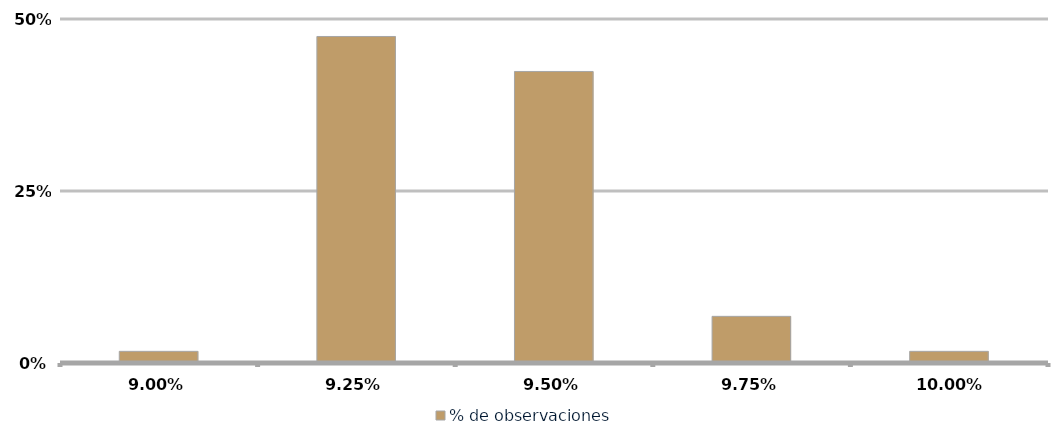
| Category | % de observaciones  |
|---|---|
| 0.09 | 0.017 |
| 0.0925 | 0.475 |
| 0.095 | 0.424 |
| 0.0975 | 0.068 |
| 0.1 | 0.017 |